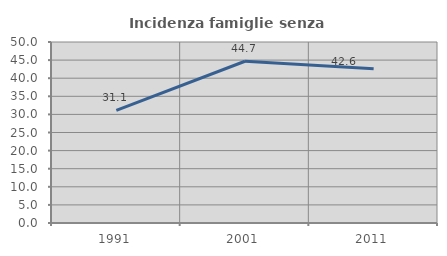
| Category | Incidenza famiglie senza nuclei |
|---|---|
| 1991.0 | 31.111 |
| 2001.0 | 44.681 |
| 2011.0 | 42.593 |